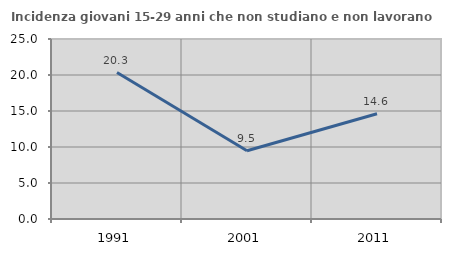
| Category | Incidenza giovani 15-29 anni che non studiano e non lavorano  |
|---|---|
| 1991.0 | 20.335 |
| 2001.0 | 9.475 |
| 2011.0 | 14.623 |